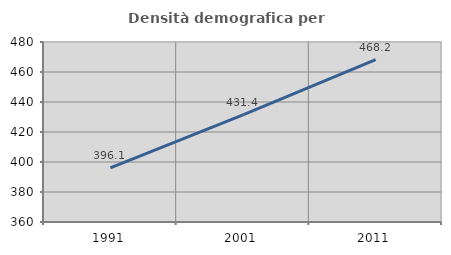
| Category | Densità demografica |
|---|---|
| 1991.0 | 396.134 |
| 2001.0 | 431.372 |
| 2011.0 | 468.205 |